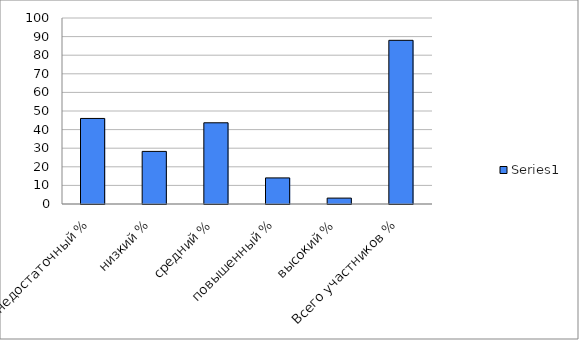
| Category | Series 0 |
|---|---|
| недостаточный % | 46 |
| низкий % | 28.281 |
| средний % | 43.665 |
| повышенный % | 14.027 |
| высокий % | 3.167 |
| Всего участников % | 88 |